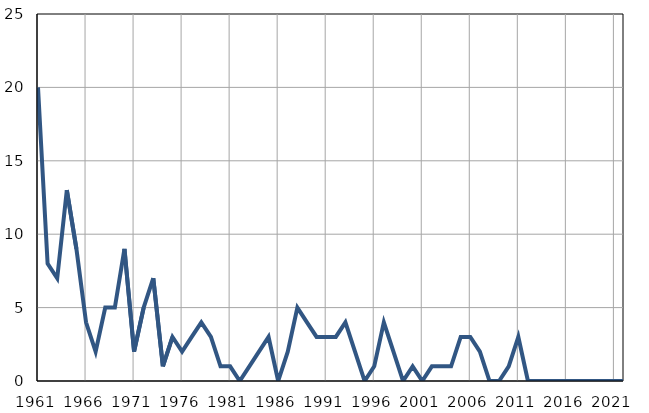
| Category | Infants
deaths |
|---|---|
| 1961.0 | 20 |
| 1962.0 | 8 |
| 1963.0 | 7 |
| 1964.0 | 13 |
| 1965.0 | 9 |
| 1966.0 | 4 |
| 1967.0 | 2 |
| 1968.0 | 5 |
| 1969.0 | 5 |
| 1970.0 | 9 |
| 1971.0 | 2 |
| 1972.0 | 5 |
| 1973.0 | 7 |
| 1974.0 | 1 |
| 1975.0 | 3 |
| 1976.0 | 2 |
| 1977.0 | 3 |
| 1978.0 | 4 |
| 1979.0 | 3 |
| 1980.0 | 1 |
| 1981.0 | 1 |
| 1982.0 | 0 |
| 1983.0 | 1 |
| 1984.0 | 2 |
| 1985.0 | 3 |
| 1986.0 | 0 |
| 1987.0 | 2 |
| 1988.0 | 5 |
| 1989.0 | 4 |
| 1990.0 | 3 |
| 1991.0 | 3 |
| 1992.0 | 3 |
| 1993.0 | 4 |
| 1994.0 | 2 |
| 1995.0 | 0 |
| 1996.0 | 1 |
| 1997.0 | 4 |
| 1998.0 | 2 |
| 1999.0 | 0 |
| 2000.0 | 1 |
| 2001.0 | 0 |
| 2002.0 | 1 |
| 2003.0 | 1 |
| 2004.0 | 1 |
| 2005.0 | 3 |
| 2006.0 | 3 |
| 2007.0 | 2 |
| 2008.0 | 0 |
| 2009.0 | 0 |
| 2010.0 | 1 |
| 2011.0 | 3 |
| 2012.0 | 0 |
| 2013.0 | 0 |
| 2014.0 | 0 |
| 2015.0 | 0 |
| 2016.0 | 0 |
| 2017.0 | 0 |
| 2018.0 | 0 |
| 2019.0 | 0 |
| 2020.0 | 0 |
| 2021.0 | 0 |
| 2022.0 | 0 |